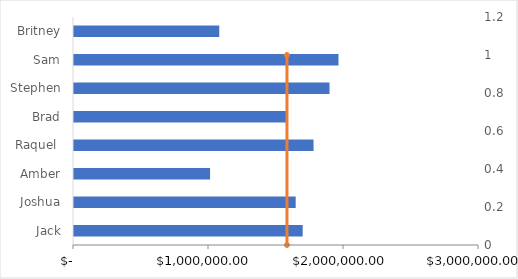
| Category | Yearly sales |
|---|---|
| Jack | 1701499 |
| Joshua | 1649547 |
| Amber | 1015299 |
| Raquel  | 1781723 |
| Brad | 1580936 |
| Stephen | 1900189 |
| Sam | 1966602 |
| Britney | 1083354 |